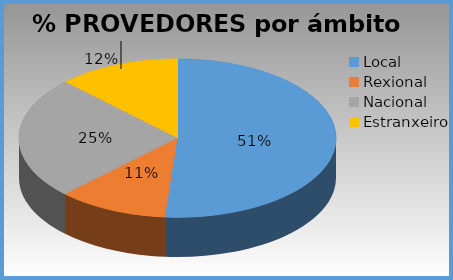
| Category | % provedores |
|---|---|
| Local | 0.513 |
| Rexional | 0.113 |
| Nacional | 0.25 |
| Estranxeiro | 0.125 |